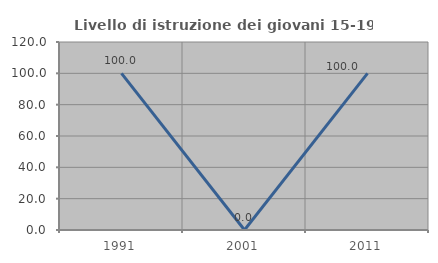
| Category | Livello di istruzione dei giovani 15-19 anni |
|---|---|
| 1991.0 | 100 |
| 2001.0 | 0 |
| 2011.0 | 100 |